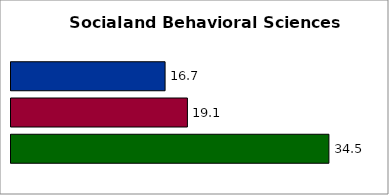
| Category | 50 states and D.C. | SREB states | State |
|---|---|---|---|
| 0 | 16.703 | 19.124 | 34.462 |